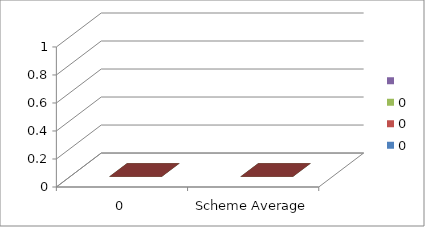
| Category | 0 | Series 3 |
|---|---|---|
| 0 | 0 |  |
| Scheme Average | 0 |  |